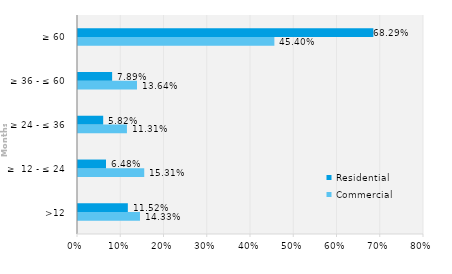
| Category | Commercial | Residential |
|---|---|---|
| >12 | 0.143 | 0.115 |
| ≥  12 - ≤ 24 | 0.153 | 0.065 |
| ≥ 24 - ≤ 36 | 0.113 | 0.058 |
| ≥ 36 - ≤ 60 | 0.136 | 0.079 |
| ≥ 60 | 0.454 | 0.683 |